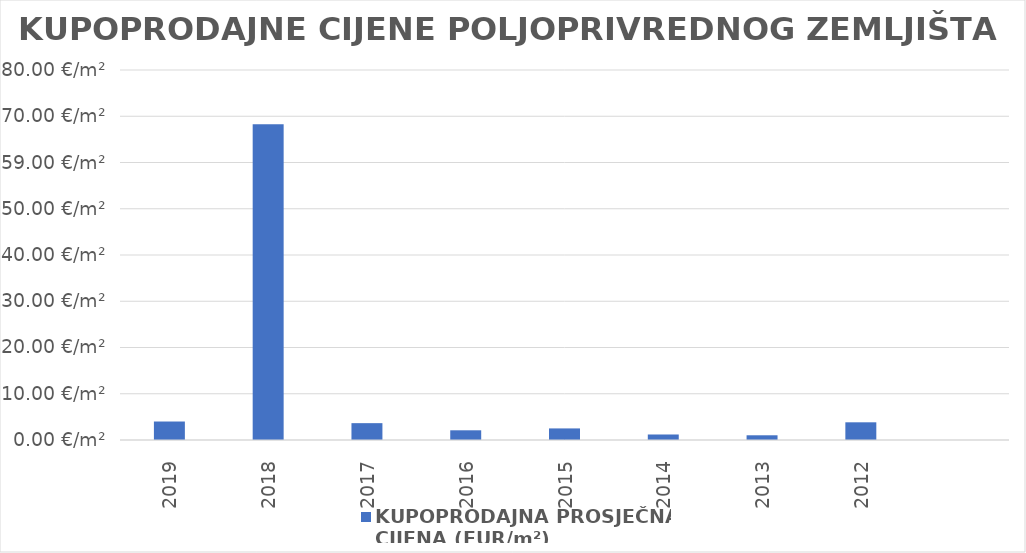
| Category | KUPOPRODAJNA PROSJEČNA 
CIJENA (EUR/m²) |
|---|---|
| 2019 | 1900-01-03 23:55:48 |
| 2018 | 1900-03-08 05:55:21 |
| 2017 | 1900-01-03 15:24:07 |
| 2016 | 1900-01-02 02:19:31 |
| 2015 | 1900-01-02 12:06:50 |
| 2014 | 1900-01-01 04:35:11 |
| 2013 | 1900-01-01 00:29:02 |
| 2012 | 1900-01-03 19:49:42 |